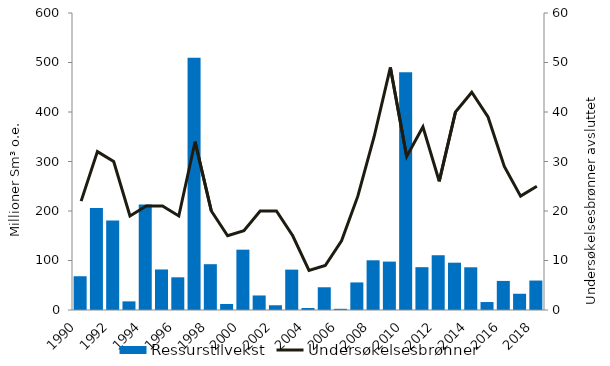
| Category | Ressurstilvekst |
|---|---|
| 1990.0 | 68.193 |
| 1991.0 | 205.969 |
| 1992.0 | 180.934 |
| 1993.0 | 17.433 |
| 1994.0 | 213.078 |
| 1995.0 | 81.89 |
| 1996.0 | 66.046 |
| 1997.0 | 509.387 |
| 1998.0 | 92.552 |
| 1999.0 | 12.186 |
| 2000.0 | 121.873 |
| 2001.0 | 29.368 |
| 2002.0 | 9.572 |
| 2003.0 | 81.565 |
| 2004.0 | 4.041 |
| 2005.0 | 45.912 |
| 2006.0 | 2.416 |
| 2007.0 | 55.693 |
| 2008.0 | 100.417 |
| 2009.0 | 97.783 |
| 2010.0 | 480.123 |
| 2011.0 | 86.492 |
| 2012.0 | 110.639 |
| 2013.0 | 95.56 |
| 2014.0 | 86.291 |
| 2015.0 | 16.076 |
| 2016.0 | 58.751 |
| 2017.0 | 32.836 |
| 2018.0 | 59.5 |